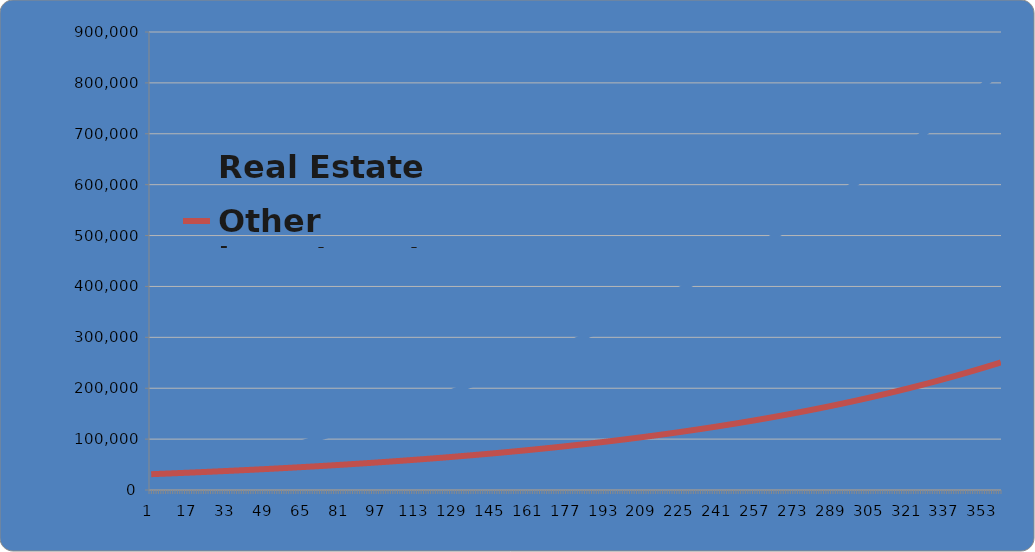
| Category | Real Estate | Other Investment |
|---|---|---|
| 0 | 9285.455 | 31068.18 |
| 1 | 10462.489 | 31249.411 |
| 2 | 11643.115 | 31431.699 |
| 3 | 12827.346 | 31615.051 |
| 4 | 14015.196 | 31799.472 |
| 5 | 15206.679 | 31984.969 |
| 6 | 16401.808 | 32171.548 |
| 7 | 17600.597 | 32359.215 |
| 8 | 18803.06 | 32547.977 |
| 9 | 20009.21 | 32737.841 |
| 10 | 21219.061 | 32928.811 |
| 11 | 22432.627 | 33120.896 |
| 12 | 23649.923 | 33314.101 |
| 13 | 24870.962 | 33508.434 |
| 14 | 26095.758 | 33703.899 |
| 15 | 27324.326 | 33900.505 |
| 16 | 28556.679 | 34098.258 |
| 17 | 29792.832 | 34297.165 |
| 18 | 31032.8 | 34497.232 |
| 19 | 32276.597 | 34698.466 |
| 20 | 33524.236 | 34900.873 |
| 21 | 34775.734 | 35104.462 |
| 22 | 36031.104 | 35309.238 |
| 23 | 37290.361 | 35515.208 |
| 24 | 38553.52 | 35722.38 |
| 25 | 39820.596 | 35930.761 |
| 26 | 41091.603 | 36140.357 |
| 27 | 42366.557 | 36351.176 |
| 28 | 43645.472 | 36563.224 |
| 29 | 44928.364 | 36776.51 |
| 30 | 46215.247 | 36991.039 |
| 31 | 47506.138 | 37206.82 |
| 32 | 48801.05 | 37423.86 |
| 33 | 50100.001 | 37642.166 |
| 34 | 51403.004 | 37861.745 |
| 35 | 52710.075 | 38082.606 |
| 36 | 54021.23 | 38304.754 |
| 37 | 55336.485 | 38528.198 |
| 38 | 56655.856 | 38752.946 |
| 39 | 57979.357 | 38979.005 |
| 40 | 59307.005 | 39206.383 |
| 41 | 60638.816 | 39435.087 |
| 42 | 61974.806 | 39665.125 |
| 43 | 63314.99 | 39896.504 |
| 44 | 64659.386 | 40129.234 |
| 45 | 66008.008 | 40363.321 |
| 46 | 67360.874 | 40598.774 |
| 47 | 68718 | 40835.6 |
| 48 | 70079.401 | 41073.808 |
| 49 | 71445.095 | 41313.405 |
| 50 | 72815.098 | 41554.4 |
| 51 | 74189.427 | 41796.801 |
| 52 | 75568.099 | 42040.615 |
| 53 | 76951.129 | 42285.852 |
| 54 | 78338.536 | 42532.52 |
| 55 | 79730.336 | 42780.626 |
| 56 | 81126.545 | 43030.18 |
| 57 | 82527.182 | 43281.189 |
| 58 | 83932.263 | 43533.663 |
| 59 | 85341.805 | 43787.609 |
| 60 | 86755.826 | 44043.037 |
| 61 | 88174.344 | 44299.954 |
| 62 | 89597.374 | 44558.371 |
| 63 | 91024.937 | 44818.295 |
| 64 | 92457.047 | 45079.735 |
| 65 | 93893.725 | 45342.7 |
| 66 | 95334.986 | 45607.199 |
| 67 | 96780.85 | 45873.241 |
| 68 | 98231.334 | 46140.835 |
| 69 | 99686.456 | 46409.99 |
| 70 | 101146.234 | 46680.715 |
| 71 | 102610.687 | 46953.019 |
| 72 | 104079.832 | 47226.911 |
| 73 | 105553.689 | 47502.402 |
| 74 | 107032.275 | 47779.499 |
| 75 | 108515.609 | 48058.213 |
| 76 | 110003.709 | 48338.552 |
| 77 | 111496.595 | 48620.527 |
| 78 | 112994.285 | 48904.147 |
| 79 | 114496.797 | 49189.421 |
| 80 | 116004.152 | 49476.36 |
| 81 | 117516.368 | 49764.972 |
| 82 | 119033.463 | 50055.267 |
| 83 | 120555.458 | 50347.256 |
| 84 | 122082.371 | 50640.949 |
| 85 | 123614.223 | 50936.354 |
| 86 | 125151.031 | 51233.483 |
| 87 | 126692.817 | 51532.345 |
| 88 | 128239.599 | 51832.95 |
| 89 | 129791.397 | 52135.309 |
| 90 | 131348.232 | 52439.432 |
| 91 | 132910.122 | 52745.328 |
| 92 | 134477.089 | 53053.01 |
| 93 | 136049.151 | 53362.485 |
| 94 | 137626.33 | 53673.767 |
| 95 | 139208.646 | 53986.864 |
| 96 | 140796.119 | 54301.787 |
| 97 | 142388.769 | 54618.547 |
| 98 | 143986.617 | 54937.156 |
| 99 | 145589.683 | 55257.622 |
| 100 | 147197.989 | 55579.958 |
| 101 | 148811.556 | 55904.175 |
| 102 | 150430.403 | 56230.283 |
| 103 | 152054.553 | 56558.293 |
| 104 | 153684.026 | 56888.216 |
| 105 | 155318.843 | 57220.064 |
| 106 | 156959.027 | 57553.848 |
| 107 | 158604.597 | 57889.578 |
| 108 | 160255.577 | 58227.268 |
| 109 | 161911.987 | 58566.927 |
| 110 | 163573.849 | 58908.567 |
| 111 | 165241.185 | 59252.2 |
| 112 | 166914.017 | 59597.838 |
| 113 | 168592.367 | 59945.492 |
| 114 | 170276.257 | 60295.174 |
| 115 | 171965.709 | 60646.896 |
| 116 | 173660.745 | 61000.67 |
| 117 | 175361.389 | 61356.507 |
| 118 | 177067.662 | 61714.42 |
| 119 | 178779.587 | 62074.421 |
| 120 | 180497.187 | 62436.521 |
| 121 | 182220.485 | 62800.734 |
| 122 | 183949.503 | 63167.072 |
| 123 | 185684.266 | 63535.547 |
| 124 | 187424.795 | 63906.171 |
| 125 | 189171.114 | 64278.957 |
| 126 | 190923.246 | 64653.917 |
| 127 | 192681.216 | 65031.065 |
| 128 | 194445.046 | 65410.413 |
| 129 | 196214.76 | 65791.974 |
| 130 | 197990.383 | 66175.76 |
| 131 | 199771.937 | 66561.785 |
| 132 | 201559.448 | 66950.063 |
| 133 | 203352.938 | 67340.605 |
| 134 | 205152.433 | 67733.425 |
| 135 | 206957.956 | 68128.536 |
| 136 | 208769.533 | 68525.953 |
| 137 | 210587.188 | 68925.688 |
| 138 | 212410.945 | 69327.754 |
| 139 | 214240.829 | 69732.166 |
| 140 | 216076.866 | 70138.937 |
| 141 | 217919.079 | 70548.081 |
| 142 | 219767.496 | 70959.611 |
| 143 | 221622.14 | 71373.542 |
| 144 | 223483.037 | 71789.888 |
| 145 | 225350.212 | 72208.662 |
| 146 | 227223.692 | 72629.88 |
| 147 | 229103.502 | 73053.554 |
| 148 | 230989.668 | 73479.7 |
| 149 | 232882.215 | 73908.331 |
| 150 | 234781.171 | 74339.463 |
| 151 | 236686.561 | 74773.11 |
| 152 | 238598.411 | 75209.286 |
| 153 | 240516.748 | 75648.007 |
| 154 | 242441.599 | 76089.287 |
| 155 | 244372.99 | 76533.141 |
| 156 | 246310.948 | 76979.585 |
| 157 | 248255.501 | 77428.632 |
| 158 | 250206.675 | 77880.299 |
| 159 | 252164.497 | 78334.601 |
| 160 | 254128.995 | 78791.553 |
| 161 | 256100.196 | 79251.17 |
| 162 | 258078.128 | 79713.469 |
| 163 | 260062.819 | 80178.464 |
| 164 | 262054.296 | 80646.172 |
| 165 | 264052.588 | 81116.608 |
| 166 | 266057.723 | 81589.788 |
| 167 | 268069.728 | 82065.728 |
| 168 | 270088.632 | 82544.445 |
| 169 | 272114.465 | 83025.954 |
| 170 | 274147.254 | 83510.273 |
| 171 | 276187.028 | 83997.416 |
| 172 | 278233.816 | 84487.401 |
| 173 | 280287.647 | 84980.244 |
| 174 | 282348.551 | 85475.962 |
| 175 | 284416.556 | 85974.572 |
| 176 | 286491.693 | 86476.09 |
| 177 | 288573.99 | 86980.534 |
| 178 | 290663.478 | 87487.92 |
| 179 | 292760.186 | 87998.267 |
| 180 | 294864.145 | 88511.59 |
| 181 | 296975.385 | 89027.907 |
| 182 | 299093.935 | 89547.237 |
| 183 | 301219.827 | 90069.596 |
| 184 | 303353.091 | 90595.002 |
| 185 | 305493.757 | 91123.473 |
| 186 | 307641.857 | 91655.026 |
| 187 | 309797.422 | 92189.681 |
| 188 | 311960.482 | 92727.454 |
| 189 | 314131.069 | 93268.364 |
| 190 | 316309.215 | 93812.429 |
| 191 | 318494.952 | 94359.668 |
| 192 | 320688.31 | 94910.1 |
| 193 | 322889.322 | 95463.742 |
| 194 | 325098.02 | 96020.614 |
| 195 | 327314.436 | 96580.734 |
| 196 | 329538.602 | 97144.122 |
| 197 | 331770.551 | 97710.796 |
| 198 | 334010.317 | 98280.775 |
| 199 | 336257.93 | 98854.08 |
| 200 | 338513.425 | 99430.729 |
| 201 | 340776.835 | 100010.741 |
| 202 | 343048.193 | 100594.137 |
| 203 | 345327.532 | 101180.936 |
| 204 | 347614.885 | 101771.159 |
| 205 | 349910.288 | 102364.824 |
| 206 | 352213.773 | 102961.952 |
| 207 | 354525.375 | 103562.563 |
| 208 | 356845.128 | 104166.678 |
| 209 | 359173.066 | 104774.317 |
| 210 | 361509.224 | 105385.501 |
| 211 | 363853.637 | 106000.249 |
| 212 | 366206.34 | 106618.584 |
| 213 | 368567.367 | 107240.526 |
| 214 | 370936.754 | 107866.096 |
| 215 | 373314.536 | 108495.315 |
| 216 | 375700.749 | 109128.204 |
| 217 | 378095.429 | 109764.785 |
| 218 | 380498.611 | 110405.08 |
| 219 | 382910.331 | 111049.109 |
| 220 | 385330.627 | 111696.896 |
| 221 | 387759.533 | 112348.461 |
| 222 | 390197.088 | 113003.827 |
| 223 | 392643.326 | 113663.016 |
| 224 | 395098.287 | 114326.05 |
| 225 | 397562.006 | 114992.952 |
| 226 | 400034.52 | 115663.744 |
| 227 | 402515.869 | 116338.45 |
| 228 | 405006.088 | 117017.091 |
| 229 | 407505.216 | 117699.69 |
| 230 | 410013.29 | 118386.272 |
| 231 | 412530.35 | 119076.858 |
| 232 | 415056.433 | 119771.473 |
| 233 | 417591.578 | 120470.14 |
| 234 | 420135.823 | 121172.883 |
| 235 | 422689.208 | 121879.725 |
| 236 | 425251.772 | 122590.69 |
| 237 | 427823.554 | 123305.802 |
| 238 | 430404.593 | 124025.086 |
| 239 | 432994.929 | 124748.566 |
| 240 | 435594.602 | 125476.266 |
| 241 | 438203.652 | 126208.21 |
| 242 | 440822.119 | 126944.425 |
| 243 | 443450.044 | 127684.934 |
| 244 | 446087.466 | 128429.763 |
| 245 | 448734.428 | 129178.937 |
| 246 | 451390.97 | 129932.48 |
| 247 | 454057.134 | 130690.42 |
| 248 | 456732.96 | 131452.781 |
| 249 | 459418.49 | 132219.588 |
| 250 | 462113.766 | 132990.869 |
| 251 | 464818.83 | 133766.649 |
| 252 | 467533.724 | 134546.955 |
| 253 | 470258.491 | 135331.812 |
| 254 | 472993.173 | 136121.248 |
| 255 | 475737.813 | 136915.288 |
| 256 | 478492.455 | 137713.961 |
| 257 | 481257.14 | 138517.292 |
| 258 | 484031.913 | 139325.31 |
| 259 | 486816.817 | 140138.041 |
| 260 | 489611.897 | 140955.513 |
| 261 | 492417.195 | 141777.753 |
| 262 | 495232.757 | 142604.79 |
| 263 | 498058.627 | 143436.651 |
| 264 | 500894.85 | 144273.365 |
| 265 | 503741.47 | 145114.96 |
| 266 | 506598.533 | 145961.464 |
| 267 | 509466.083 | 146812.906 |
| 268 | 512344.167 | 147669.314 |
| 269 | 515232.83 | 148530.719 |
| 270 | 518132.119 | 149397.148 |
| 271 | 521042.079 | 150268.631 |
| 272 | 523962.757 | 151145.198 |
| 273 | 526894.199 | 152026.878 |
| 274 | 529836.453 | 152913.702 |
| 275 | 532789.565 | 153805.698 |
| 276 | 535753.583 | 154702.898 |
| 277 | 538728.555 | 155605.332 |
| 278 | 541714.527 | 156513.03 |
| 279 | 544711.549 | 157426.022 |
| 280 | 547719.669 | 158344.341 |
| 281 | 550738.934 | 159268.016 |
| 282 | 553769.394 | 160197.08 |
| 283 | 556811.097 | 161131.563 |
| 284 | 559864.093 | 162071.497 |
| 285 | 562928.432 | 163016.914 |
| 286 | 566004.162 | 163967.846 |
| 287 | 569091.334 | 164924.325 |
| 288 | 572189.998 | 165886.383 |
| 289 | 575300.205 | 166854.054 |
| 290 | 578422.004 | 167827.369 |
| 291 | 581555.447 | 168806.362 |
| 292 | 584700.584 | 169791.066 |
| 293 | 587857.468 | 170781.514 |
| 294 | 591026.15 | 171777.739 |
| 295 | 594206.682 | 172779.776 |
| 296 | 597399.115 | 173787.658 |
| 297 | 600603.503 | 174801.42 |
| 298 | 603819.897 | 175821.095 |
| 299 | 607048.351 | 176846.718 |
| 300 | 610288.918 | 177878.324 |
| 301 | 613541.651 | 178915.947 |
| 302 | 616806.604 | 179959.623 |
| 303 | 620083.83 | 181009.388 |
| 304 | 623373.385 | 182065.276 |
| 305 | 626675.321 | 183127.323 |
| 306 | 629989.695 | 184195.566 |
| 307 | 633316.56 | 185270.04 |
| 308 | 636655.973 | 186350.782 |
| 309 | 640007.988 | 187437.828 |
| 310 | 643372.662 | 188531.216 |
| 311 | 646750.05 | 189630.981 |
| 312 | 650140.209 | 190737.162 |
| 313 | 653543.195 | 191849.795 |
| 314 | 656959.065 | 192968.919 |
| 315 | 660387.877 | 194094.571 |
| 316 | 663829.687 | 195226.79 |
| 317 | 667284.553 | 196365.612 |
| 318 | 670752.534 | 197511.079 |
| 319 | 674233.687 | 198663.226 |
| 320 | 677728.071 | 199822.095 |
| 321 | 681235.745 | 200987.724 |
| 322 | 684756.768 | 202160.153 |
| 323 | 688291.199 | 203339.42 |
| 324 | 691839.098 | 204525.567 |
| 325 | 695400.525 | 205718.633 |
| 326 | 698975.54 | 206918.658 |
| 327 | 702564.203 | 208125.683 |
| 328 | 706166.577 | 209339.75 |
| 329 | 709782.721 | 210560.898 |
| 330 | 713412.696 | 211789.17 |
| 331 | 717056.566 | 213024.607 |
| 332 | 720714.392 | 214267.251 |
| 333 | 724386.235 | 215517.143 |
| 334 | 728072.16 | 216774.326 |
| 335 | 731772.228 | 218038.843 |
| 336 | 735486.503 | 219310.737 |
| 337 | 739215.049 | 220590.049 |
| 338 | 742957.929 | 221876.824 |
| 339 | 746715.208 | 223171.106 |
| 340 | 750486.949 | 224472.937 |
| 341 | 754273.219 | 225782.363 |
| 342 | 758074.081 | 227099.427 |
| 343 | 761889.602 | 228424.173 |
| 344 | 765719.847 | 229756.648 |
| 345 | 769564.882 | 231096.895 |
| 346 | 773424.774 | 232444.96 |
| 347 | 777299.589 | 233800.889 |
| 348 | 781189.395 | 235164.727 |
| 349 | 785094.258 | 236536.522 |
| 350 | 789014.247 | 237916.318 |
| 351 | 792949.429 | 239304.163 |
| 352 | 796899.873 | 240700.104 |
| 353 | 800865.648 | 242104.188 |
| 354 | 804846.823 | 243516.463 |
| 355 | 808843.466 | 244936.975 |
| 356 | 812855.648 | 246365.774 |
| 357 | 816883.439 | 247802.908 |
| 358 | 820926.909 | 249248.425 |
| 359 | 824986.129 | 250702.374 |